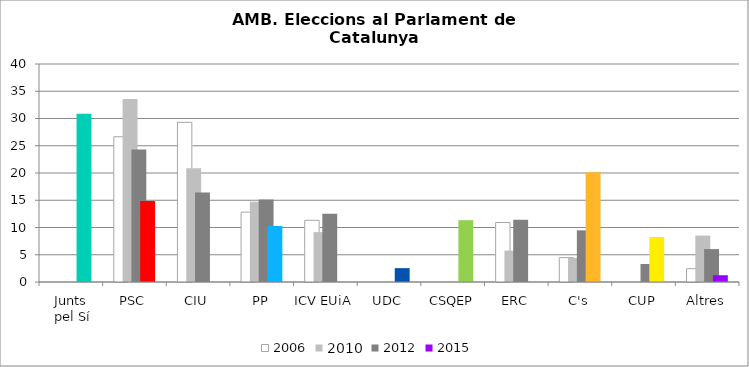
| Category | 2006 | 2010 | 2012 | 2015 |
|---|---|---|---|---|
| Junts
 pel Sí | 0 | 0 | 0 | 30.874 |
| PSC | 26.65 | 33.57 | 24.33 | 14.853 |
| CIU | 29.3 | 20.85 | 16.4 | 0 |
| PP | 12.82 | 14.73 | 15.13 | 10.274 |
| ICV EUiA | 11.32 | 9.15 | 12.51 | 0 |
| UDC | 0 | 0 | 0 | 2.54 |
| CSQEP | 0 | 0 | 0 | 11.344 |
| ERC | 10.91 | 5.76 | 11.42 | 0 |
| C's | 4.47 | 4.42 | 9.48 | 20.13 |
| CUP | 0 | 0 | 3.3 | 8.262 |
| Altres | 2.44 | 8.52 | 6.04 | 1.241 |